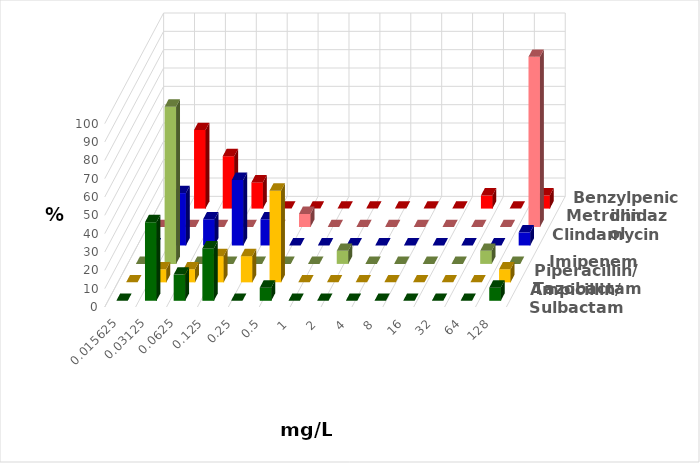
| Category | Ampicillin/ Sulbactam | Piperacillin/ Tazobactam | Imipenem | Clindamycin | Metronidazol | Benzylpenicillin |
|---|---|---|---|---|---|---|
| 0.015625 | 0 | 0 | 0 | 0 | 0 | 0 |
| 0.03125 | 42.857 | 7.143 | 85.714 | 28.571 | 0 | 42.857 |
| 0.0625 | 14.286 | 7.143 | 0 | 14.286 | 0 | 28.571 |
| 0.125 | 28.571 | 14.286 | 0 | 35.714 | 0 | 14.286 |
| 0.25 | 0 | 14.286 | 0 | 14.286 | 0 | 0 |
| 0.5 | 7.143 | 50 | 0 | 0 | 7.143 | 0 |
| 1.0 | 0 | 0 | 0 | 0 | 0 | 0 |
| 2.0 | 0 | 0 | 7.143 | 0 | 0 | 0 |
| 4.0 | 0 | 0 | 0 | 0 | 0 | 0 |
| 8.0 | 0 | 0 | 0 | 0 | 0 | 0 |
| 16.0 | 0 | 0 | 0 | 0 | 0 | 0 |
| 32.0 | 0 | 0 | 0 | 0 | 0 | 7.143 |
| 64.0 | 0 | 0 | 7.143 | 0 | 0 | 0 |
| 128.0 | 7.143 | 7.143 | 0 | 7.143 | 92.857 | 7.143 |